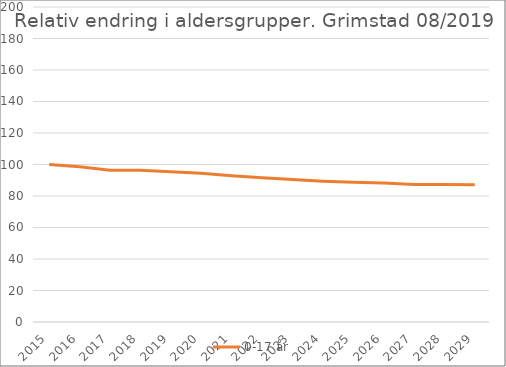
| Category | 0-17 år |
|---|---|
| 2015.0 | 100 |
| 2016.0 | 98.631 |
| 2017.0 | 96.395 |
| 2018.0 | 96.328 |
| 2019.0 | 95.445 |
| 2020.0 | 94.371 |
| 2021.0 | 92.794 |
| 2022.0 | 91.594 |
| 2023.0 | 90.498 |
| 2024.0 | 89.416 |
| 2025.0 | 88.719 |
| 2026.0 | 88.319 |
| 2027.0 | 87.378 |
| 2028.0 | 87.25 |
| 2029.0 | 87.204 |